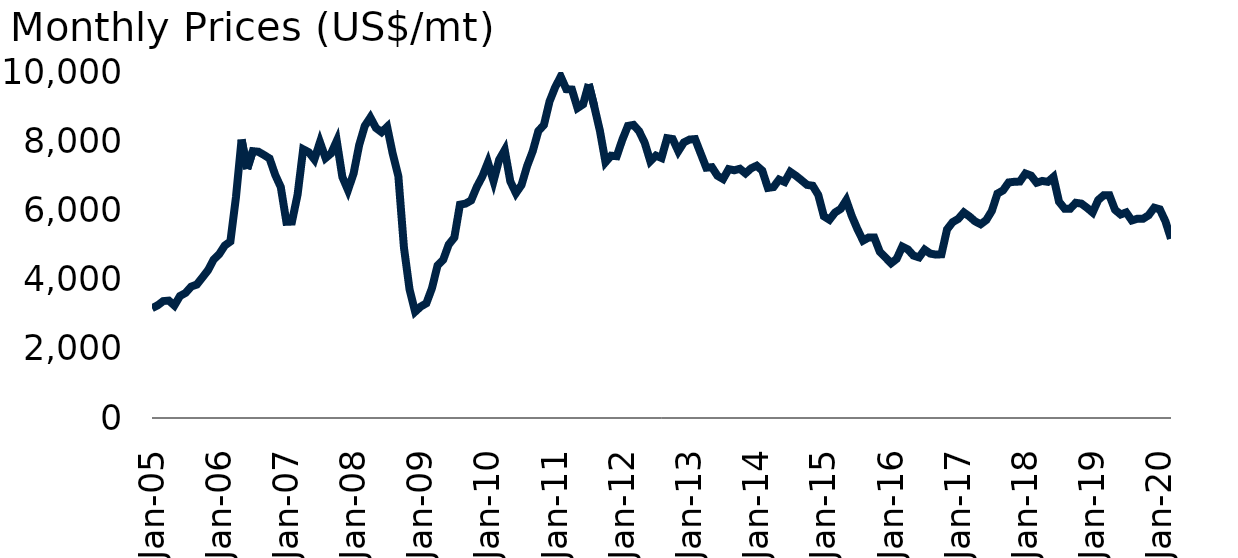
| Category | Copper |
|---|---|
| 2005-01-01 | 3170 |
| 2005-02-01 | 3253.7 |
| 2005-03-01 | 3379.49 |
| 2005-04-01 | 3394.476 |
| 2005-05-01 | 3249.1 |
| 2005-06-01 | 3524.068 |
| 2005-07-01 | 3614.214 |
| 2005-08-01 | 3797.75 |
| 2005-09-01 | 3857.841 |
| 2005-10-01 | 4059.762 |
| 2005-11-01 | 4269.341 |
| 2005-12-01 | 4576.775 |
| 2006-01-01 | 4734.333 |
| 2006-02-01 | 4982.4 |
| 2006-03-01 | 5102.848 |
| 2006-04-01 | 6387.778 |
| 2006-05-01 | 8045.857 |
| 2006-06-01 | 7197.614 |
| 2006-07-01 | 7712.095 |
| 2006-08-01 | 7695.659 |
| 2006-09-01 | 7602.357 |
| 2006-10-01 | 7500.386 |
| 2006-11-01 | 7029.182 |
| 2006-12-01 | 6675.105 |
| 2007-01-01 | 5669.659 |
| 2007-02-01 | 5676.45 |
| 2007-03-01 | 6452.477 |
| 2007-04-01 | 7766.474 |
| 2007-05-01 | 7681.42 |
| 2007-06-01 | 7474.38 |
| 2007-07-01 | 7972.57 |
| 2007-08-01 | 7513.5 |
| 2007-09-01 | 7648.975 |
| 2007-10-01 | 8008.435 |
| 2007-11-01 | 6966.705 |
| 2007-12-01 | 6587.667 |
| 2008-01-01 | 7061.023 |
| 2008-02-01 | 7887.69 |
| 2008-03-01 | 8439.289 |
| 2008-04-01 | 8684.932 |
| 2008-05-01 | 8382.75 |
| 2008-06-01 | 8260.595 |
| 2008-07-01 | 8414.043 |
| 2008-08-01 | 7634.7 |
| 2008-09-01 | 6990.864 |
| 2008-10-01 | 4925.696 |
| 2008-11-01 | 3717 |
| 2008-12-01 | 3071.976 |
| 2009-01-01 | 3220.69 |
| 2009-02-01 | 3314.725 |
| 2009-03-01 | 3749.75 |
| 2009-04-01 | 4406.55 |
| 2009-05-01 | 4568.632 |
| 2009-06-01 | 5013.955 |
| 2009-07-01 | 5215.543 |
| 2009-08-01 | 6165.3 |
| 2009-09-01 | 6196.432 |
| 2009-10-01 | 6287.977 |
| 2009-11-01 | 6675.595 |
| 2009-12-01 | 6981.714 |
| 2010-01-01 | 7386.25 |
| 2010-02-01 | 6848.175 |
| 2010-03-01 | 7462.826 |
| 2010-04-01 | 7745.075 |
| 2010-05-01 | 6837.684 |
| 2010-06-01 | 6499.295 |
| 2010-07-01 | 6735.25 |
| 2010-08-01 | 7283.952 |
| 2010-09-01 | 7709.295 |
| 2010-10-01 | 8292.405 |
| 2010-11-01 | 8469.886 |
| 2010-12-01 | 9147.262 |
| 2011-01-01 | 9555.7 |
| 2011-02-01 | 9867.6 |
| 2011-03-01 | 9503.36 |
| 2011-04-01 | 9492.79 |
| 2011-05-01 | 8959.9 |
| 2011-06-01 | 9066.85 |
| 2011-07-01 | 9650.46 |
| 2011-08-01 | 9000.76 |
| 2011-09-01 | 8300.14 |
| 2011-10-01 | 7394.19 |
| 2011-11-01 | 7581.02 |
| 2011-12-01 | 7565.48 |
| 2012-01-01 | 8040.47 |
| 2012-02-01 | 8441.49 |
| 2012-03-01 | 8470.78 |
| 2012-04-01 | 8289.48 |
| 2012-05-01 | 7955.643 |
| 2012-06-01 | 7423.024 |
| 2012-07-01 | 7584.261 |
| 2012-08-01 | 7515.533 |
| 2012-09-01 | 8087.74 |
| 2012-10-01 | 8062.03 |
| 2012-11-01 | 7711.227 |
| 2012-12-01 | 7966.487 |
| 2013-01-01 | 8047.36 |
| 2013-02-01 | 8060.925 |
| 2013-03-01 | 7645.583 |
| 2013-04-01 | 7234.28 |
| 2013-05-01 | 7249.413 |
| 2013-06-01 | 7000.238 |
| 2013-07-01 | 6906.641 |
| 2013-08-01 | 7192.92 |
| 2013-09-01 | 7159.269 |
| 2013-10-01 | 7203.022 |
| 2013-11-01 | 7070.655 |
| 2013-12-01 | 7214.9 |
| 2014-01-01 | 7291.47 |
| 2014-02-01 | 7149.21 |
| 2014-03-01 | 6650.04 |
| 2014-04-01 | 6673.56 |
| 2014-05-01 | 6891.13 |
| 2014-06-01 | 6821.14 |
| 2014-07-01 | 7113.38 |
| 2014-08-01 | 7001.84 |
| 2014-09-01 | 6872.22 |
| 2014-10-01 | 6737.48 |
| 2014-11-01 | 6712.85 |
| 2014-12-01 | 6446.45 |
| 2015-01-01 | 5830.54 |
| 2015-02-01 | 5729.27 |
| 2015-03-01 | 5939.67 |
| 2015-04-01 | 6042.09 |
| 2015-05-01 | 6294.78 |
| 2015-06-01 | 5833.01 |
| 2015-07-01 | 5456.75 |
| 2015-08-01 | 5127.3 |
| 2015-09-01 | 5217.25 |
| 2015-10-01 | 5216.09 |
| 2015-11-01 | 4799.9 |
| 2015-12-01 | 4638.83 |
| 2016-01-01 | 4471.79 |
| 2016-02-01 | 4598.62 |
| 2016-03-01 | 4953.8 |
| 2016-04-01 | 4872.74 |
| 2016-05-01 | 4694.54 |
| 2016-06-01 | 4641.97 |
| 2016-07-01 | 4864.9 |
| 2016-08-01 | 4751.67 |
| 2016-09-01 | 4722.2 |
| 2016-10-01 | 4731.26 |
| 2016-11-01 | 5450.93 |
| 2016-12-01 | 5660.35 |
| 2017-01-01 | 5754.56 |
| 2017-02-01 | 5940.91 |
| 2017-03-01 | 5824.63 |
| 2017-04-01 | 5683.9 |
| 2017-05-01 | 5599.56 |
| 2017-06-01 | 5719.76 |
| 2017-07-01 | 5985.12 |
| 2017-08-01 | 6485.63 |
| 2017-09-01 | 6577.17 |
| 2017-10-01 | 6807.6 |
| 2017-11-01 | 6826.55 |
| 2017-12-01 | 6833.89 |
| 2018-01-01 | 7065.85 |
| 2018-02-01 | 7006.52 |
| 2018-03-01 | 6799.18 |
| 2018-04-01 | 6851.51 |
| 2018-05-01 | 6825.27 |
| 2018-06-01 | 6965.86 |
| 2018-07-01 | 6250.75 |
| 2018-08-01 | 6051.05 |
| 2018-09-01 | 6050.76 |
| 2018-10-01 | 6219.59 |
| 2018-11-01 | 6195.92 |
| 2018-12-01 | 6075.32 |
| 2019-01-01 | 5939.1 |
| 2019-02-01 | 6300.49 |
| 2019-03-01 | 6439.46 |
| 2019-04-01 | 6438.36 |
| 2019-05-01 | 6017.9 |
| 2019-06-01 | 5882.23 |
| 2019-07-01 | 5941.2 |
| 2019-08-01 | 5709.44 |
| 2019-09-01 | 5759.25 |
| 2019-10-01 | 5757.3 |
| 2019-11-01 | 5859.95 |
| 2019-12-01 | 6077.06 |
| 2020-01-01 | 6031.21 |
| 2020-02-01 | 5687.75 |
| 2020-03-01 | 5182.63 |